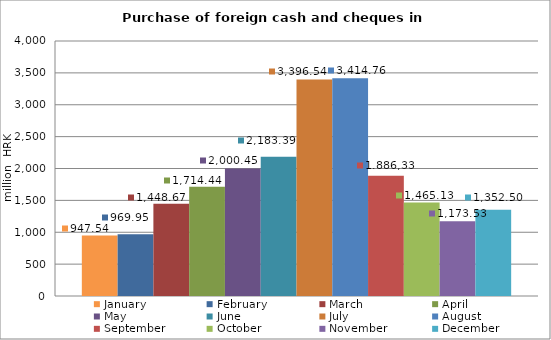
| Category | January | February | March | April | May | June | July | August | September | October | November | December |
|---|---|---|---|---|---|---|---|---|---|---|---|---|
| 0 | 947.54 | 969.946 | 1448.668 | 1714.441 | 2000.445 | 2183.392 | 3396.545 | 3414.757 | 1886.33 | 1465.132 | 1173.533 | 1352.502 |